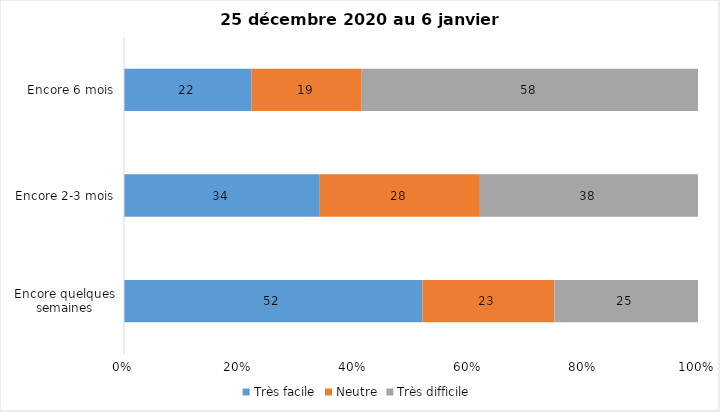
| Category | Très facile | Neutre | Très difficile |
|---|---|---|---|
| Encore quelques semaines | 52 | 23 | 25 |
| Encore 2-3 mois | 34 | 28 | 38 |
| Encore 6 mois | 22 | 19 | 58 |